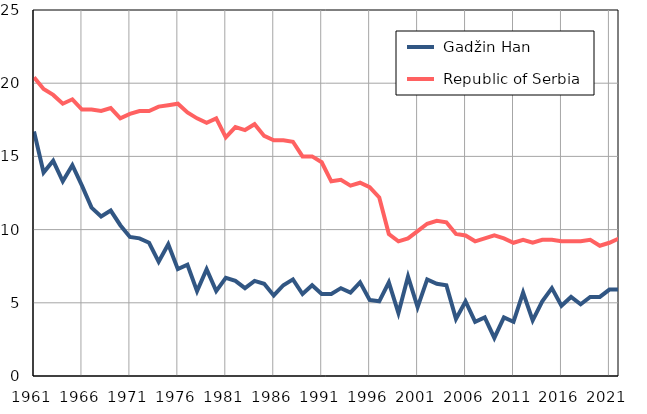
| Category |  Gadžin Han |  Republic of Serbia |
|---|---|---|
| 1961.0 | 16.7 | 20.4 |
| 1962.0 | 13.9 | 19.6 |
| 1963.0 | 14.7 | 19.2 |
| 1964.0 | 13.3 | 18.6 |
| 1965.0 | 14.4 | 18.9 |
| 1966.0 | 13 | 18.2 |
| 1967.0 | 11.5 | 18.2 |
| 1968.0 | 10.9 | 18.1 |
| 1969.0 | 11.3 | 18.3 |
| 1970.0 | 10.3 | 17.6 |
| 1971.0 | 9.5 | 17.9 |
| 1972.0 | 9.4 | 18.1 |
| 1973.0 | 9.1 | 18.1 |
| 1974.0 | 7.8 | 18.4 |
| 1975.0 | 9 | 18.5 |
| 1976.0 | 7.3 | 18.6 |
| 1977.0 | 7.6 | 18 |
| 1978.0 | 5.8 | 17.6 |
| 1979.0 | 7.3 | 17.3 |
| 1980.0 | 5.8 | 17.6 |
| 1981.0 | 6.7 | 16.3 |
| 1982.0 | 6.5 | 17 |
| 1983.0 | 6 | 16.8 |
| 1984.0 | 6.5 | 17.2 |
| 1985.0 | 6.3 | 16.4 |
| 1986.0 | 5.5 | 16.1 |
| 1987.0 | 6.2 | 16.1 |
| 1988.0 | 6.6 | 16 |
| 1989.0 | 5.6 | 15 |
| 1990.0 | 6.2 | 15 |
| 1991.0 | 5.6 | 14.6 |
| 1992.0 | 5.6 | 13.3 |
| 1993.0 | 6 | 13.4 |
| 1994.0 | 5.7 | 13 |
| 1995.0 | 6.4 | 13.2 |
| 1996.0 | 5.2 | 12.9 |
| 1997.0 | 5.1 | 12.2 |
| 1998.0 | 6.4 | 9.7 |
| 1999.0 | 4.3 | 9.2 |
| 2000.0 | 6.8 | 9.4 |
| 2001.0 | 4.7 | 9.9 |
| 2002.0 | 6.6 | 10.4 |
| 2003.0 | 6.3 | 10.6 |
| 2004.0 | 6.2 | 10.5 |
| 2005.0 | 3.9 | 9.7 |
| 2006.0 | 5.1 | 9.6 |
| 2007.0 | 3.7 | 9.2 |
| 2008.0 | 4 | 9.4 |
| 2009.0 | 2.6 | 9.6 |
| 2010.0 | 4 | 9.4 |
| 2011.0 | 3.7 | 9.1 |
| 2012.0 | 5.7 | 9.3 |
| 2013.0 | 3.8 | 9.1 |
| 2014.0 | 5.1 | 9.3 |
| 2015.0 | 6 | 9.3 |
| 2016.0 | 4.8 | 9.2 |
| 2017.0 | 5.4 | 9.2 |
| 2018.0 | 4.9 | 9.2 |
| 2019.0 | 5.4 | 9.3 |
| 2020.0 | 5.4 | 8.9 |
| 2021.0 | 5.9 | 9.1 |
| 2022.0 | 5.9 | 9.4 |